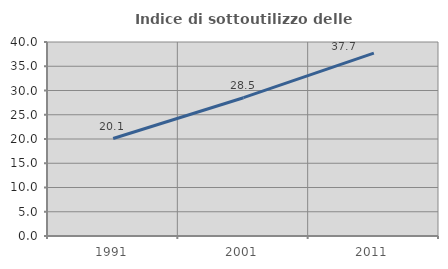
| Category | Indice di sottoutilizzo delle abitazioni  |
|---|---|
| 1991.0 | 20.092 |
| 2001.0 | 28.515 |
| 2011.0 | 37.705 |